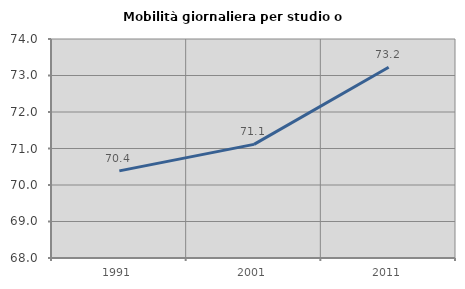
| Category | Mobilità giornaliera per studio o lavoro |
|---|---|
| 1991.0 | 70.387 |
| 2001.0 | 71.113 |
| 2011.0 | 73.225 |